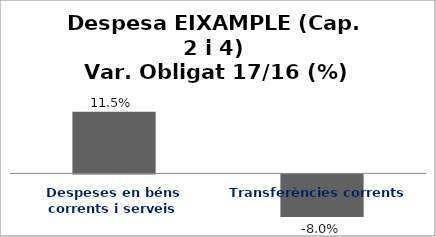
| Category | Series 0 |
|---|---|
| Despeses en béns corrents i serveis | 0.115 |
| Transferències corrents | -0.08 |